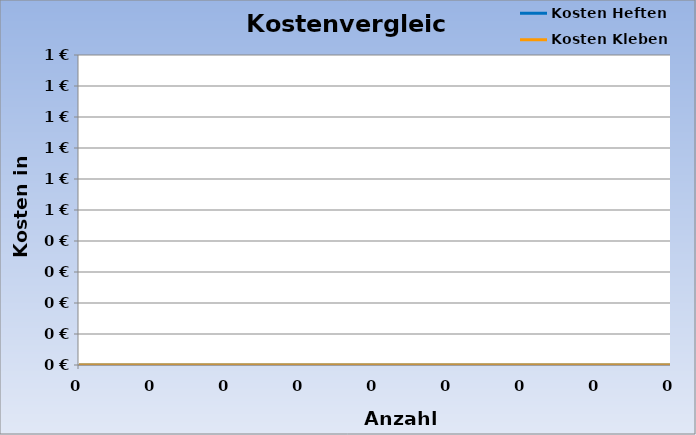
| Category | Kosten Heften | Kosten Kleben |
|---|---|---|
| 0.0 | 0 | 0 |
| 0.0 | 0 | 0 |
| 0.0 | 0 | 0 |
| 0.0 | 0 | 0 |
| 0.0 | 0 | 0 |
| 0.0 | 0 | 0 |
| 0.0 | 0 | 0 |
| 0.0 | 0 | 0 |
| 0.0 | 0 | 0 |